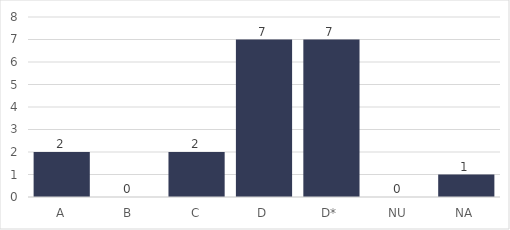
| Category | 2018 |
|---|---|
| A | 2 |
| B | 0 |
| C | 2 |
| D | 7 |
| D* | 7 |
| NU | 0 |
| NA | 1 |